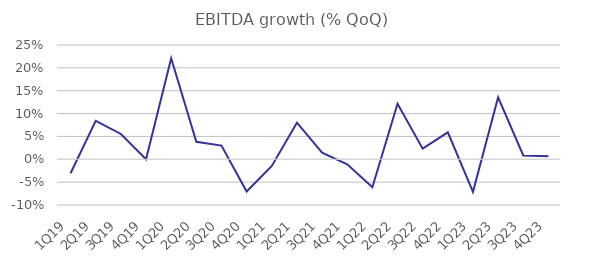
| Category | EBITDA growth (% QoQ) |
|---|---|
| 1Q19 | -0.031 |
| 2Q19 | 0.084 |
| 3Q19 | 0.055 |
| 4Q19 | 0 |
| 1Q20 | 0.221 |
| 2Q20 | 0.038 |
| 3Q20 | 0.03 |
| 4Q20 | -0.07 |
| 1Q21 | -0.015 |
| 2Q21 | 0.08 |
| 3Q21 | 0.015 |
| 4Q21 | -0.011 |
| 1Q22 | -0.061 |
| 2Q22 | 0.122 |
| 3Q22 | 0.023 |
| 4Q22 | 0.059 |
| 1Q23 | -0.071 |
| 2Q23 | 0.136 |
| 3Q23 | 0.008 |
| 4Q23 | 0.007 |